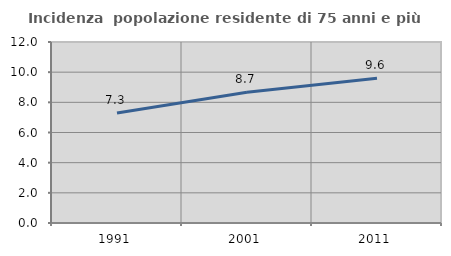
| Category | Incidenza  popolazione residente di 75 anni e più |
|---|---|
| 1991.0 | 7.294 |
| 2001.0 | 8.671 |
| 2011.0 | 9.601 |